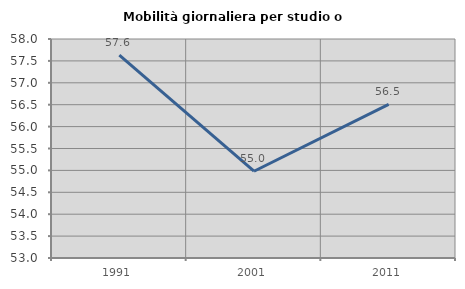
| Category | Mobilità giornaliera per studio o lavoro |
|---|---|
| 1991.0 | 57.634 |
| 2001.0 | 54.981 |
| 2011.0 | 56.506 |